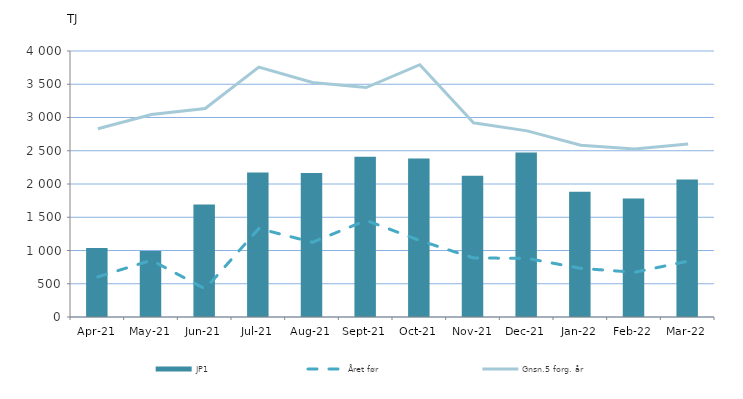
| Category | JP1 |
|---|---|
| 2021-04-01 | 1037.249 |
| 2021-05-01 | 992.357 |
| 2021-06-01 | 1690.445 |
| 2021-07-01 | 2172.634 |
| 2021-08-01 | 2166.718 |
| 2021-09-01 | 2411.501 |
| 2021-10-01 | 2382.547 |
| 2021-11-01 | 2123.914 |
| 2021-12-01 | 2474.28 |
| 2022-01-01 | 1884.803 |
| 2022-02-01 | 1780.925 |
| 2022-03-01 | 2068.582 |